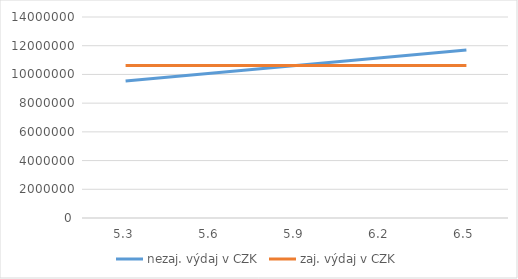
| Category | nezaj. výdaj v CZK | zaj. výdaj v CZK |
|---|---|---|
| 5.3 | 9540000 | 10620000 |
| 5.6 | 10080000 | 10620000 |
| 5.9 | 10620000 | 10620000 |
| 6.2 | 11160000 | 10620000 |
| 6.5 | 11700000 | 10620000 |